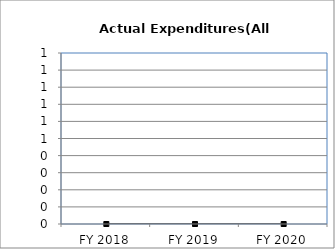
| Category | Actual Expenditures(All Funds) |
|---|---|
| FY 2018 | 0 |
| FY 2019 | 0 |
| FY 2020 | 0 |